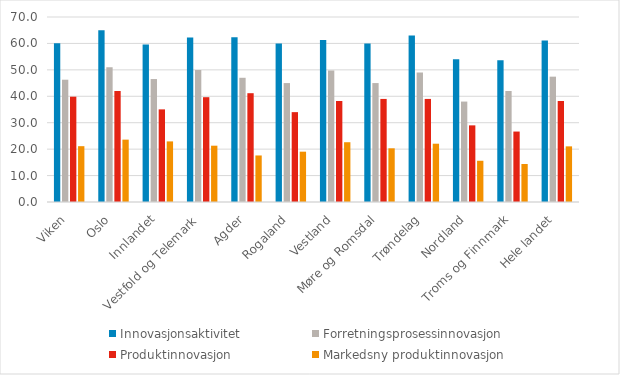
| Category | Innovasjonsaktivitet | Forretningsprosessinnovasjon | Produktinnovasjon | Markedsny produktinnovasjon |
|---|---|---|---|---|
| Viken | 60.082 | 46.272 | 39.847 | 21.121 |
| Oslo | 65 | 51 | 42 | 23.596 |
| Innlandet | 59.572 | 46.524 | 35.048 | 22.93 |
| Vestfold og Telemark | 62.285 | 49.913 | 39.656 | 21.305 |
| Agder | 62.361 | 47 | 41.168 | 17.609 |
| Rogaland | 60 | 45 | 34 | 19.043 |
| Vestland | 61.313 | 49.75 | 38.219 | 22.619 |
| Møre og Romsdal | 60 | 45 | 39 | 20.318 |
| Trøndelag | 63 | 49 | 39 | 22.056 |
| Nordland | 54 | 38 | 29 | 15.601 |
| Troms og Finnmark | 53.625 | 42 | 26.656 | 14.378 |
| Hele landet | 61.147 | 47.427 | 38.209 | 21.052 |